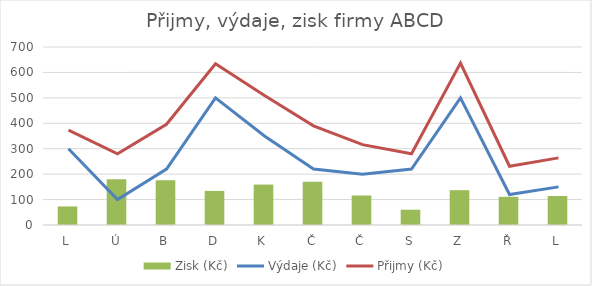
| Category | Zisk (Kč) |
|---|---|
| L | 73 |
| Ú | 180 |
| B | 176 |
| D | 134 |
| K | 159 |
| Č | 170 |
| Č | 116 |
| S | 60 |
| Z | 137 |
| Ř | 111 |
| L | 114 |